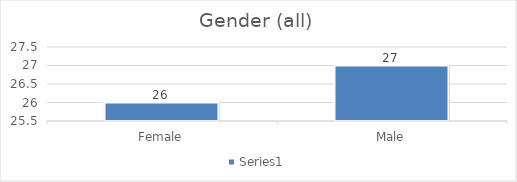
| Category | Series 0 |
|---|---|
| Female | 26 |
| Male | 27 |